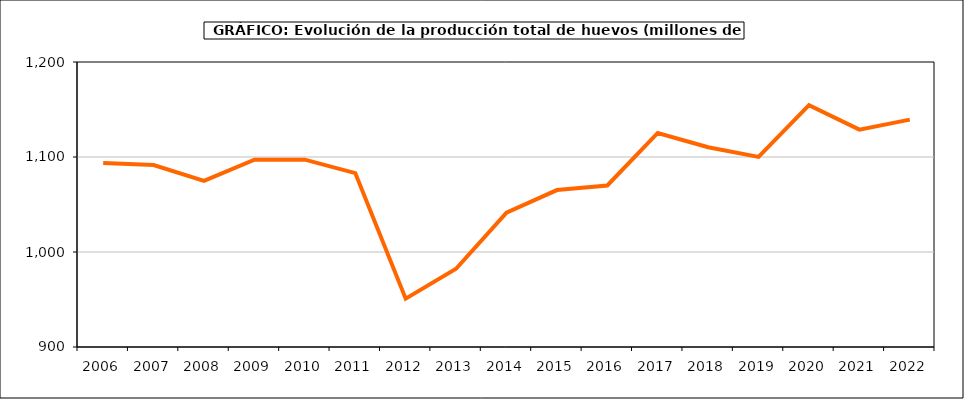
| Category | huevos |
|---|---|
| 2006.0 | 1093.721 |
| 2007.0 | 1091.465 |
| 2008.0 | 1074.834 |
| 2009.0 | 1097.178 |
| 2010.0 | 1097.2 |
| 2011.0 | 1083.082 |
| 2012.0 | 950.879 |
| 2013.0 | 982.375 |
| 2014.0 | 1041.522 |
| 2015.0 | 1065.202 |
| 2016.0 | 1070 |
| 2017.0 | 1125.287 |
| 2018.0 | 1110.274 |
| 2019.0 | 1100.164 |
| 2020.0 | 1154.544 |
| 2021.0 | 1128.836 |
| 2022.0 | 1139.317 |